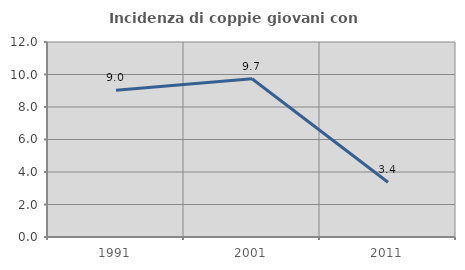
| Category | Incidenza di coppie giovani con figli |
|---|---|
| 1991.0 | 9.028 |
| 2001.0 | 9.735 |
| 2011.0 | 3.371 |